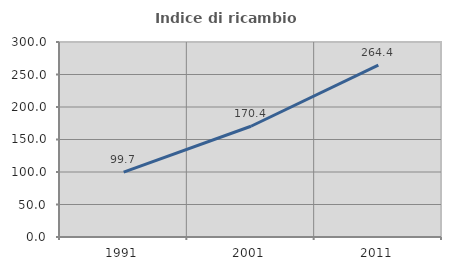
| Category | Indice di ricambio occupazionale  |
|---|---|
| 1991.0 | 99.695 |
| 2001.0 | 170.397 |
| 2011.0 | 264.444 |